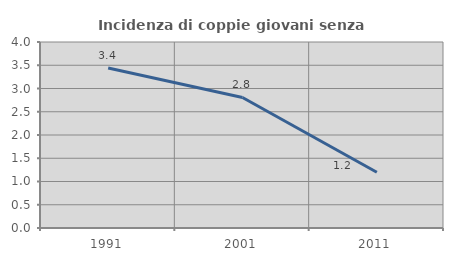
| Category | Incidenza di coppie giovani senza figli |
|---|---|
| 1991.0 | 3.441 |
| 2001.0 | 2.808 |
| 2011.0 | 1.199 |